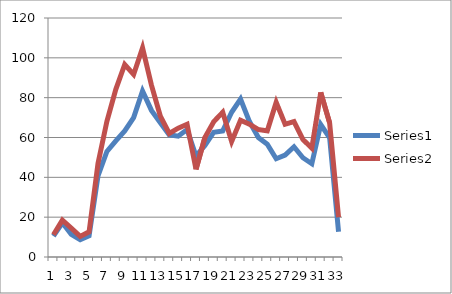
| Category | Series 0 | Series 1 |
|---|---|---|
| 0 | 10.5 | 11.167 |
| 1 | 17.167 | 18.5 |
| 2 | 11.333 | 14.5 |
| 3 | 8.667 | 10.333 |
| 4 | 10.667 | 12.667 |
| 5 | 40.667 | 47 |
| 6 | 53 | 68.167 |
| 7 | 58.333 | 84.167 |
| 8 | 63.333 | 96.667 |
| 9 | 70 | 91.667 |
| 10 | 83.333 | 105 |
| 11 | 73.6 | 86.267 |
| 12 | 67.333 | 70.667 |
| 13 | 61.333 | 62 |
| 14 | 60.667 | 64.667 |
| 15 | 64 | 66.667 |
| 16 | 50.667 | 44 |
| 17 | 56 | 60 |
| 18 | 62.667 | 68 |
| 19 | 63.333 | 72.667 |
| 20 | 72.667 | 58 |
| 21 | 79.333 | 68.667 |
| 22 | 68 | 66.667 |
| 23 | 60 | 64 |
| 24 | 56.667 | 63.333 |
| 25 | 49.333 | 77.667 |
| 26 | 51.167 | 66.667 |
| 27 | 55.333 | 68 |
| 28 | 49.833 | 59 |
| 29 | 46.833 | 54.667 |
| 30 | 66.5 | 82.667 |
| 31 | 59.833 | 67.333 |
| 32 | 12.667 | 20 |